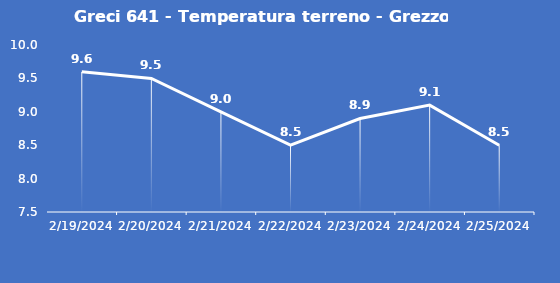
| Category | Greci 641 - Temperatura terreno - Grezzo (°C) |
|---|---|
| 2/19/24 | 9.6 |
| 2/20/24 | 9.5 |
| 2/21/24 | 9 |
| 2/22/24 | 8.5 |
| 2/23/24 | 8.9 |
| 2/24/24 | 9.1 |
| 2/25/24 | 8.5 |